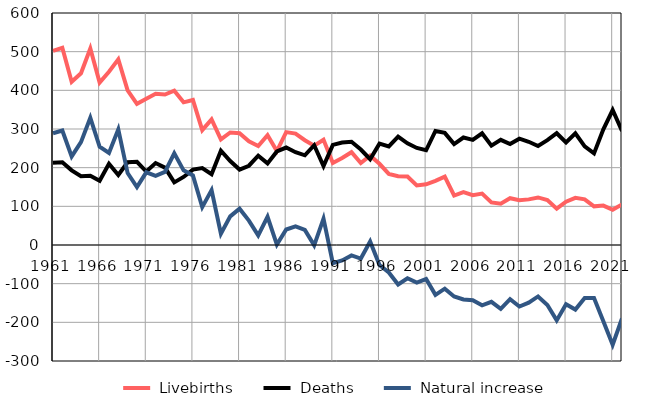
| Category |  Livebirths |  Deaths |  Natural increase |
|---|---|---|---|
| 1961.0 | 502 | 213 | 289 |
| 1962.0 | 510 | 214 | 296 |
| 1963.0 | 422 | 193 | 229 |
| 1964.0 | 444 | 178 | 266 |
| 1965.0 | 508 | 179 | 329 |
| 1966.0 | 420 | 166 | 254 |
| 1967.0 | 448 | 210 | 238 |
| 1968.0 | 480 | 181 | 299 |
| 1969.0 | 400 | 214 | 186 |
| 1970.0 | 365 | 215 | 150 |
| 1971.0 | 378 | 190 | 188 |
| 1972.0 | 391 | 212 | 179 |
| 1973.0 | 389 | 200 | 189 |
| 1974.0 | 399 | 162 | 237 |
| 1975.0 | 369 | 176 | 193 |
| 1976.0 | 375 | 195 | 180 |
| 1977.0 | 297 | 199 | 98 |
| 1978.0 | 325 | 183 | 142 |
| 1979.0 | 273 | 244 | 29 |
| 1980.0 | 291 | 217 | 74 |
| 1981.0 | 289 | 195 | 94 |
| 1982.0 | 268 | 205 | 63 |
| 1983.0 | 256 | 231 | 25 |
| 1984.0 | 284 | 211 | 73 |
| 1985.0 | 243 | 242 | 1 |
| 1986.0 | 292 | 252 | 40 |
| 1987.0 | 288 | 240 | 48 |
| 1988.0 | 271 | 232 | 39 |
| 1989.0 | 257 | 258 | -1 |
| 1990.0 | 272 | 204 | 68 |
| 1991.0 | 212 | 259 | -47 |
| 1992.0 | 225 | 265 | -40 |
| 1993.0 | 240 | 267 | -27 |
| 1994.0 | 212 | 247 | -35 |
| 1995.0 | 231 | 222 | 9 |
| 1996.0 | 210 | 262 | -52 |
| 1997.0 | 184 | 255 | -71 |
| 1998.0 | 178 | 280 | -102 |
| 1999.0 | 177 | 263 | -86 |
| 2000.0 | 154 | 251 | -97 |
| 2001.0 | 157 | 245 | -88 |
| 2002.0 | 166 | 295 | -129 |
| 2003.0 | 177 | 290 | -113 |
| 2004.0 | 128 | 261 | -133 |
| 2005.0 | 137 | 278 | -141 |
| 2006.0 | 129 | 272 | -143 |
| 2007.0 | 133 | 289 | -156 |
| 2008.0 | 110 | 257 | -147 |
| 2009.0 | 107 | 272 | -165 |
| 2010.0 | 121 | 261 | -140 |
| 2011.0 | 116 | 275 | -159 |
| 2012.0 | 118 | 267 | -149 |
| 2013.0 | 123 | 256 | -133 |
| 2014.0 | 116 | 271 | -155 |
| 2015.0 | 94 | 289 | -195 |
| 2016.0 | 112 | 265 | -153 |
| 2017.0 | 122 | 289 | -167 |
| 2018.0 | 118 | 255 | -137 |
| 2019.0 | 100 | 237 | -137 |
| 2020.0 | 102 | 299 | -197 |
| 2021.0 | 91 | 349 | -258 |
| 2022.0 | 105 | 295 | -190 |